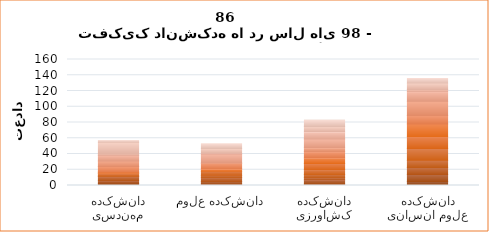
| Category | Series 0 | Series 1 | Series 2 | Series 3 | Series 4 | Series 5 | Series 6 | Series 7 | Series 8 | Series 9 | Series 10 | Series 11 | Series 12 |
|---|---|---|---|---|---|---|---|---|---|---|---|---|---|
| دانشکده مهندسی | 3 | 3 | 5 | 1 | 3 | 1 | 1 | 7 | 7 | 7 | 2 | 15 | 2 |
| دانشکده علوم | 2 | 3 | 5 | 3 | 5 | 0 | 3 | 7 | 1 | 11 | 1 | 6 | 6 |
| دانشکده کشاورزی | 2 | 5 | 3 | 4 | 6 | 8 | 7 | 8 | 5 | 11 | 9 | 7 | 8 |
| دانشکده علوم انسانی | 5 | 9 | 9 | 9 | 15 | 15 | 16 | 11 | 18 | 12 | 3 | 8 | 6 |